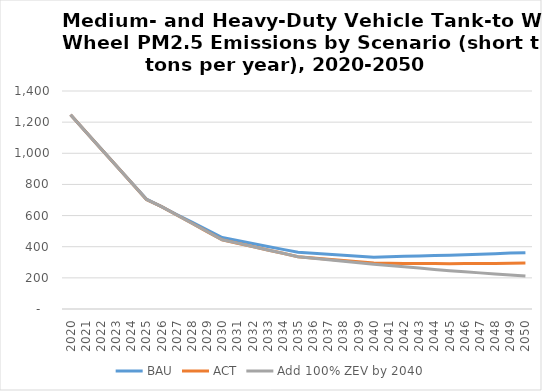
| Category | BAU | ACT | Add 100% ZEV by 2040 |
|---|---|---|---|
| 2020.0 | 1247 | 1247 | 1246.703 |
| 2021.0 | 1139 | 1138 | 1138 |
| 2022.0 | 1031 | 1029 | 1029 |
| 2023.0 | 922 | 921 | 921 |
| 2024.0 | 814 | 812 | 812 |
| 2025.0 | 706 | 703 | 703.414 |
| 2026.0 | 657 | 657 | 657 |
| 2027.0 | 607 | 604 | 604 |
| 2028.0 | 558 | 551 | 551 |
| 2029.0 | 508 | 497 | 498 |
| 2030.0 | 459 | 444 | 444.387 |
| 2031.0 | 440 | 422 | 423 |
| 2032.0 | 421 | 401 | 401 |
| 2033.0 | 402 | 379 | 379 |
| 2034.0 | 383 | 358 | 358 |
| 2035.0 | 364 | 336 | 336.021 |
| 2036.0 | 358 | 328 | 326 |
| 2037.0 | 352 | 320 | 316 |
| 2038.0 | 345 | 311 | 307 |
| 2039.0 | 339 | 303 | 297 |
| 2040.0 | 333 | 295 | 287.127 |
| 2041.0 | 335 | 294 | 279 |
| 2042.0 | 338 | 293 | 271 |
| 2043.0 | 340 | 293 | 263 |
| 2044.0 | 343 | 292 | 254 |
| 2045.0 | 345 | 291 | 246.113 |
| 2046.0 | 348 | 292 | 239 |
| 2047.0 | 352 | 293 | 232 |
| 2048.0 | 355 | 293 | 225 |
| 2049.0 | 359 | 294 | 218 |
| 2050.0 | 362 | 295 | 211.424 |